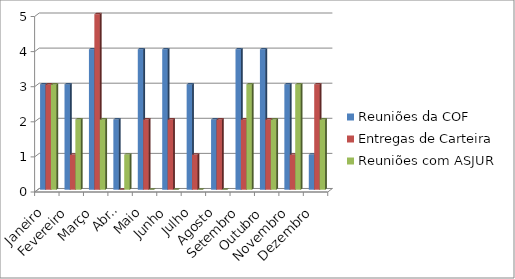
| Category | Reuniões da COF | Entregas de Carteira | Reuniões com ASJUR |
|---|---|---|---|
| Janeiro | 3 | 3 | 3 |
| Fevereiro | 3 | 1 | 2 |
| Março | 4 | 5 | 2 |
| Abril | 2 | 0 | 1 |
| Maio | 4 | 2 | 0 |
| Junho | 4 | 2 | 0 |
| Julho | 3 | 1 | 0 |
| Agosto | 2 | 2 | 0 |
| Setembro | 4 | 2 | 3 |
| Outubro | 4 | 2 | 2 |
| Novembro | 3 | 1 | 3 |
| Dezembro | 1 | 3 | 2 |